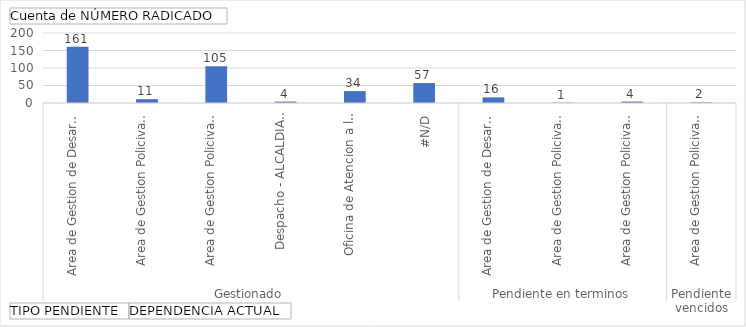
| Category | Total |
|---|---|
| 0 | 161 |
| 1 | 11 |
| 2 | 105 |
| 3 | 4 |
| 4 | 34 |
| 5 | 57 |
| 6 | 16 |
| 7 | 1 |
| 8 | 4 |
| 9 | 2 |